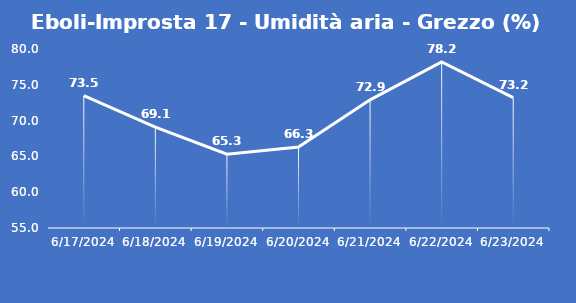
| Category | Eboli-Improsta 17 - Umidità aria - Grezzo (%) |
|---|---|
| 6/17/24 | 73.5 |
| 6/18/24 | 69.1 |
| 6/19/24 | 65.3 |
| 6/20/24 | 66.3 |
| 6/21/24 | 72.9 |
| 6/22/24 | 78.2 |
| 6/23/24 | 73.2 |